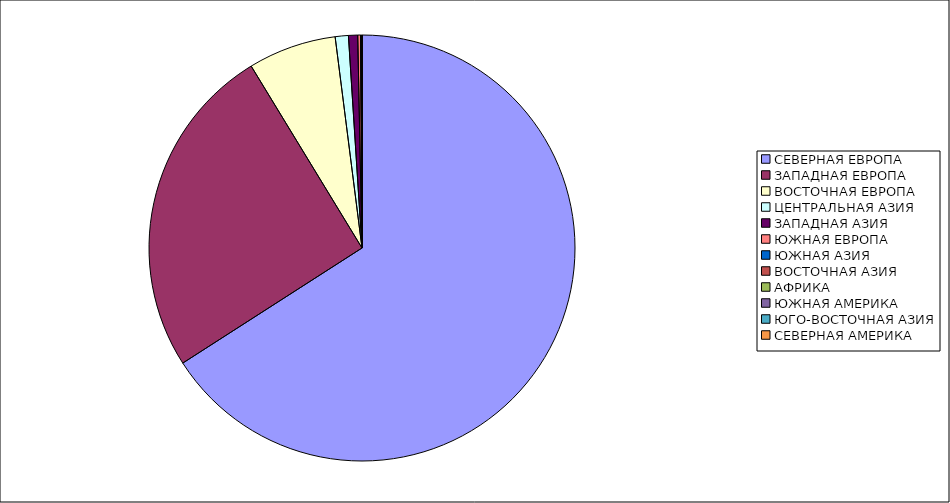
| Category | Оборот |
|---|---|
| СЕВЕРНАЯ ЕВРОПА | 65.914 |
| ЗАПАДНАЯ ЕВРОПА | 25.377 |
| ВОСТОЧНАЯ ЕВРОПА | 6.694 |
| ЦЕНТРАЛЬНАЯ АЗИЯ | 0.998 |
| ЗАПАДНАЯ АЗИЯ | 0.696 |
| ЮЖНАЯ ЕВРОПА | 0.211 |
| ЮЖНАЯ АЗИЯ | 0.041 |
| ВОСТОЧНАЯ АЗИЯ | 0.04 |
| АФРИКА | 0.016 |
| ЮЖНАЯ АМЕРИКА | 0.012 |
| ЮГО-ВОСТОЧНАЯ АЗИЯ | 0 |
| СЕВЕРНАЯ АМЕРИКА | 0 |